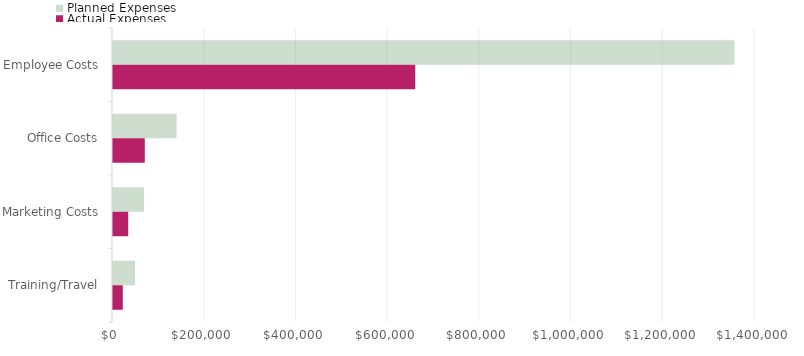
| Category | Planned Expenses | Actual Expenses |
|---|---|---|
| Employee Costs | 1355090 | 659130 |
| Office Costs | 138740 | 69350 |
| Marketing Costs | 67800 | 33159 |
| Training/Travel | 48000 | 21300 |